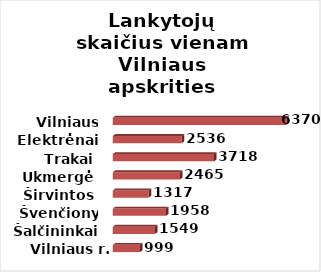
| Category | Series 0 |
|---|---|
| Vilniaus r. | 999 |
| Šalčininkai | 1549 |
| Švenčionys | 1958 |
| Širvintos | 1317 |
| Ukmergė | 2465 |
| Trakai | 3718 |
| Elektrėnai | 2536 |
| Vilniaus m. | 6370 |